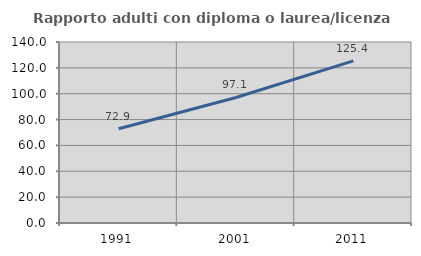
| Category | Rapporto adulti con diploma o laurea/licenza media  |
|---|---|
| 1991.0 | 72.881 |
| 2001.0 | 97.101 |
| 2011.0 | 125.385 |